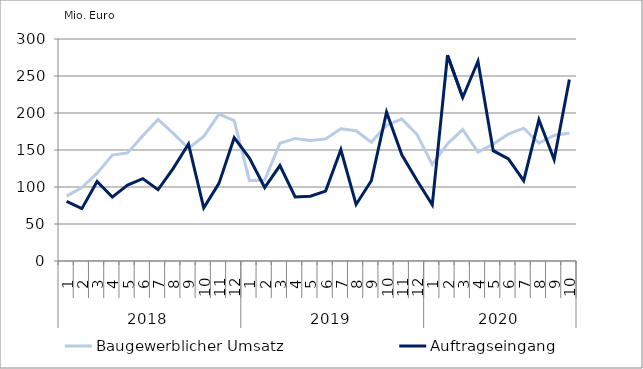
| Category | Baugewerblicher Umsatz | Auftragseingang |
|---|---|---|
| 0 | 87640.529 | 80684.627 |
| 1 | 99259.455 | 70746.763 |
| 2 | 118764.324 | 107538.747 |
| 3 | 143144.178 | 86374.619 |
| 4 | 146070.782 | 102661.329 |
| 5 | 169150.753 | 111287.709 |
| 6 | 191277.885 | 96286.662 |
| 7 | 172425.535 | 125142.495 |
| 8 | 152354.98 | 158112.302 |
| 9 | 168372.756 | 71808.619 |
| 10 | 198558.472 | 104904.147 |
| 11 | 189665.914 | 166653.461 |
| 12 | 108616.605 | 139065.287 |
| 13 | 109331.58 | 99318.609 |
| 14 | 159117.81 | 129002.041 |
| 15 | 165654.287 | 86579.2 |
| 16 | 162976.056 | 87644.362 |
| 17 | 165026.188 | 94463.186 |
| 18 | 178622.938 | 150345.08 |
| 19 | 176074.101 | 76434.317 |
| 20 | 160663.041 | 108444.162 |
| 21 | 183589.485 | 201122.697 |
| 22 | 191777.213 | 143514.792 |
| 23 | 170885.223 | 108780.022 |
| 24 | 130445.562 | 75891.481 |
| 25 | 158433.655 | 277923.85 |
| 26 | 177529.832 | 220973.626 |
| 27 | 147259.799 | 269936.091 |
| 28 | 157965.891 | 149072.895 |
| 29 | 171647.778 | 137984.76 |
| 30 | 179530.732 | 108645.965 |
| 31 | 159480.457 | 190771.468 |
| 32 | 169638.111 | 136988.906 |
| 33 | 173040.053 | 245341.603 |